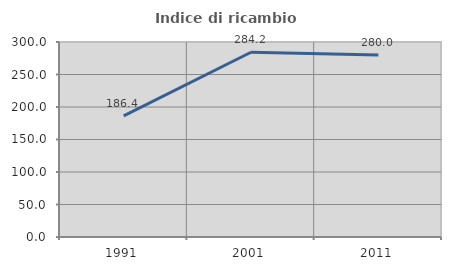
| Category | Indice di ricambio occupazionale  |
|---|---|
| 1991.0 | 186.364 |
| 2001.0 | 284.211 |
| 2011.0 | 280 |